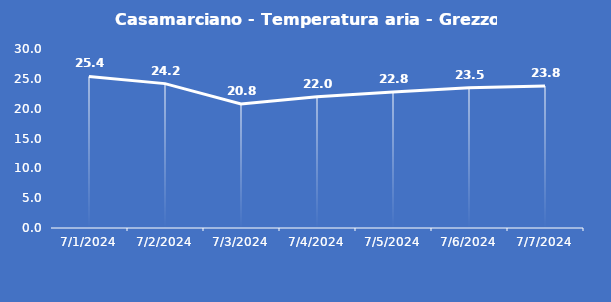
| Category | Casamarciano - Temperatura aria - Grezzo (°C) |
|---|---|
| 7/1/24 | 25.4 |
| 7/2/24 | 24.2 |
| 7/3/24 | 20.8 |
| 7/4/24 | 22 |
| 7/5/24 | 22.8 |
| 7/6/24 | 23.5 |
| 7/7/24 | 23.8 |